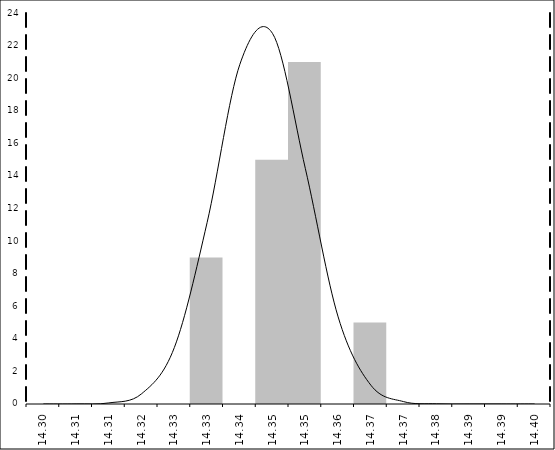
| Category | Series 1 |
|---|---|
| 14.3 | 0 |
| 14.306666666666667 | 0 |
| 14.313333333333333 | 0 |
| 14.319999999999999 | 0 |
| 14.326666666666664 | 0 |
| 14.33333333333333 | 9 |
| 14.339999999999996 | 0 |
| 14.346666666666662 | 15 |
| 14.353333333333328 | 21 |
| 14.359999999999994 | 0 |
| 14.36666666666666 | 5 |
| 14.373333333333326 | 0 |
| 14.379999999999992 | 0 |
| 14.386666666666658 | 0 |
| 14.393333333333324 | 0 |
| 14.4 | 0 |